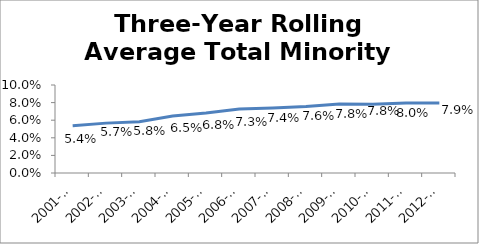
| Category | Three-Year Rolling Average Total Minority |
|---|---|
| 2001-2003 | 0.054 |
| 2002-2004 | 0.057 |
| 2003-2005 | 0.058 |
| 2004-2006 | 0.065 |
| 2005-2007 | 0.068 |
| 2006-2008 | 0.073 |
| 2007-2009 | 0.074 |
| 2008-2010 | 0.076 |
| 2009-11 | 0.078 |
| 2010-12 | 0.078 |
| 2011-13 | 0.08 |
| 2012-14 | 0.079 |